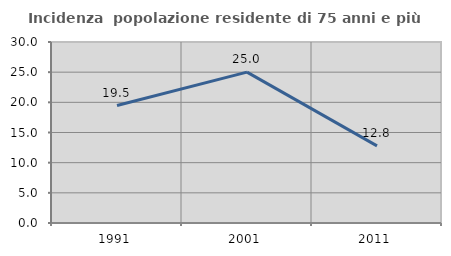
| Category | Incidenza  popolazione residente di 75 anni e più |
|---|---|
| 1991.0 | 19.463 |
| 2001.0 | 25 |
| 2011.0 | 12.782 |